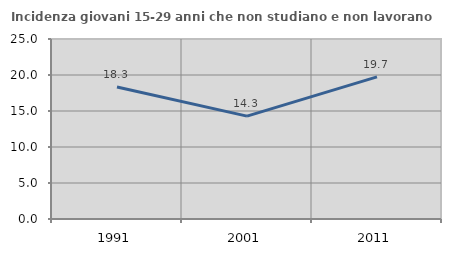
| Category | Incidenza giovani 15-29 anni che non studiano e non lavorano  |
|---|---|
| 1991.0 | 18.343 |
| 2001.0 | 14.286 |
| 2011.0 | 19.745 |